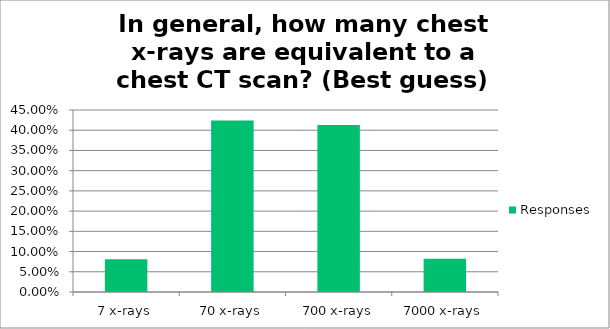
| Category | Responses |
|---|---|
| 7 x-rays | 0.081 |
| 70 x-rays | 0.424 |
| 700 x-rays | 0.413 |
| 7000 x-rays | 0.082 |